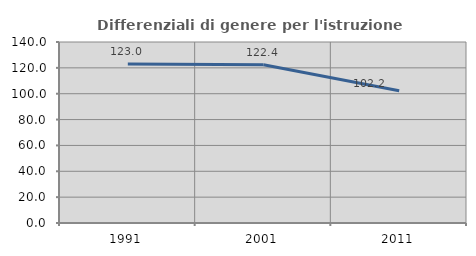
| Category | Differenziali di genere per l'istruzione superiore |
|---|---|
| 1991.0 | 122.984 |
| 2001.0 | 122.387 |
| 2011.0 | 102.231 |